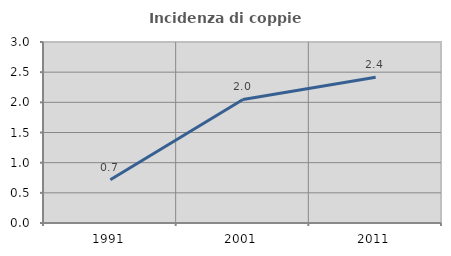
| Category | Incidenza di coppie miste |
|---|---|
| 1991.0 | 0.718 |
| 2001.0 | 2.048 |
| 2011.0 | 2.416 |